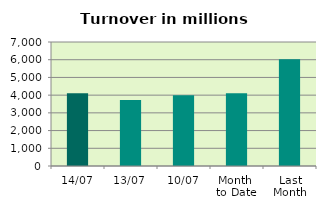
| Category | Series 0 |
|---|---|
| 14/07 | 4110.513 |
| 13/07 | 3727.138 |
| 10/07 | 3994.883 |
| Month 
to Date | 4107.149 |
| Last
Month | 6026.772 |